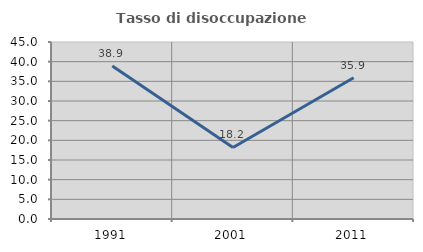
| Category | Tasso di disoccupazione giovanile  |
|---|---|
| 1991.0 | 38.889 |
| 2001.0 | 18.182 |
| 2011.0 | 35.897 |